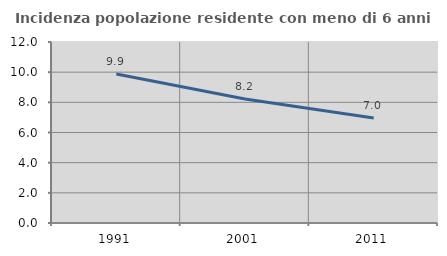
| Category | Incidenza popolazione residente con meno di 6 anni |
|---|---|
| 1991.0 | 9.873 |
| 2001.0 | 8.222 |
| 2011.0 | 6.968 |